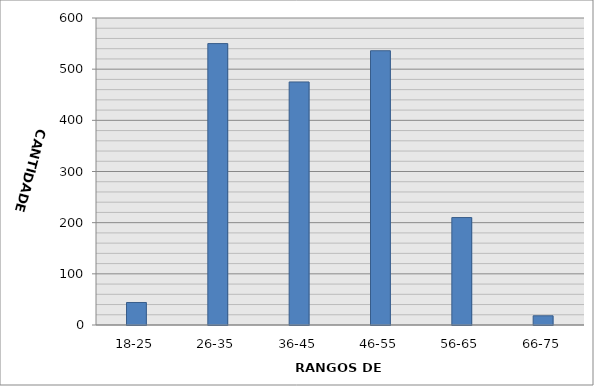
| Category | Series 0 |
|---|---|
| 18-25 | 44 |
| 26-35 | 550 |
| 36-45 | 475 |
| 46-55 | 536 |
| 56-65 | 210 |
| 66-75 | 18 |